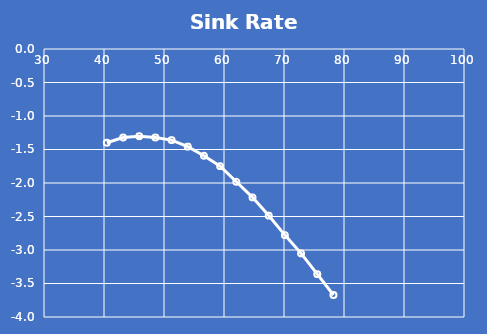
| Category | Sink Rate (kt) |
|---|---|
| 40.470886862826355 | -1.399 |
| 43.16894598701478 | -1.321 |
| 45.867005111203206 | -1.302 |
| 48.56506423539163 | -1.321 |
| 51.26312335958006 | -1.36 |
| 53.961182483768475 | -1.457 |
| 56.6592416079569 | -1.593 |
| 59.357300732145326 | -1.748 |
| 62.05535985633375 | -1.981 |
| 64.75341898052217 | -2.215 |
| 67.4514781047106 | -2.487 |
| 70.14953722889902 | -2.778 |
| 72.84759635308744 | -3.05 |
| 75.54565547727587 | -3.361 |
| 78.24371460146429 | -3.672 |